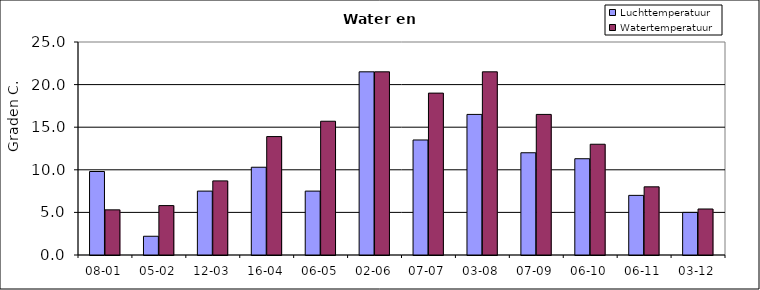
| Category | Luchttemperatuur | Watertemperatuur |
|---|---|---|
| 08-01 | 9.8 | 5.3 |
| 05-02 | 2.2 | 5.8 |
| 12-03 | 7.5 | 8.7 |
| 16-04 | 10.3 | 13.9 |
| 06-05 | 7.5 | 15.7 |
| 02-06 | 21.5 | 21.5 |
| 07-07 | 13.5 | 19 |
| 03-08 | 16.5 | 21.5 |
| 07-09 | 12 | 16.5 |
| 06-10 | 11.3 | 13 |
| 06-11 | 7 | 8 |
| 03-12 | 5 | 5.4 |